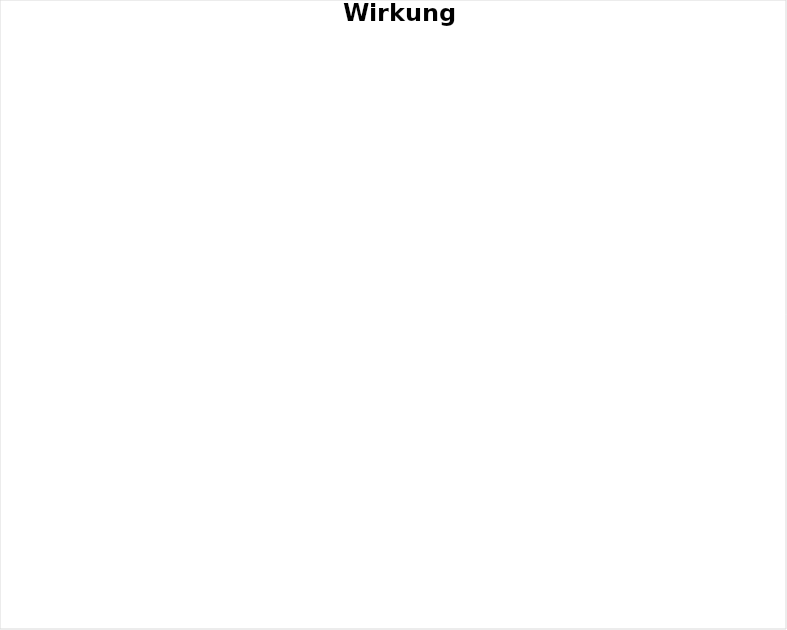
| Category | Series 0 |
|---|---|
| Kann selbständig Wohnen | 0 |
| Kann selbständig Wohnen mit Begleitung | 0 |
| Braucht den Betreuten Rahmen | 0 |